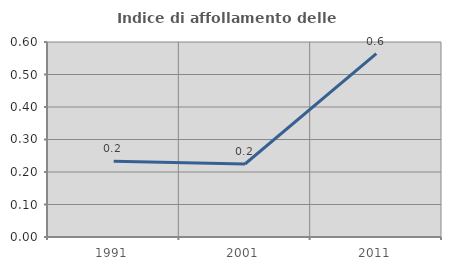
| Category | Indice di affollamento delle abitazioni  |
|---|---|
| 1991.0 | 0.233 |
| 2001.0 | 0.225 |
| 2011.0 | 0.564 |